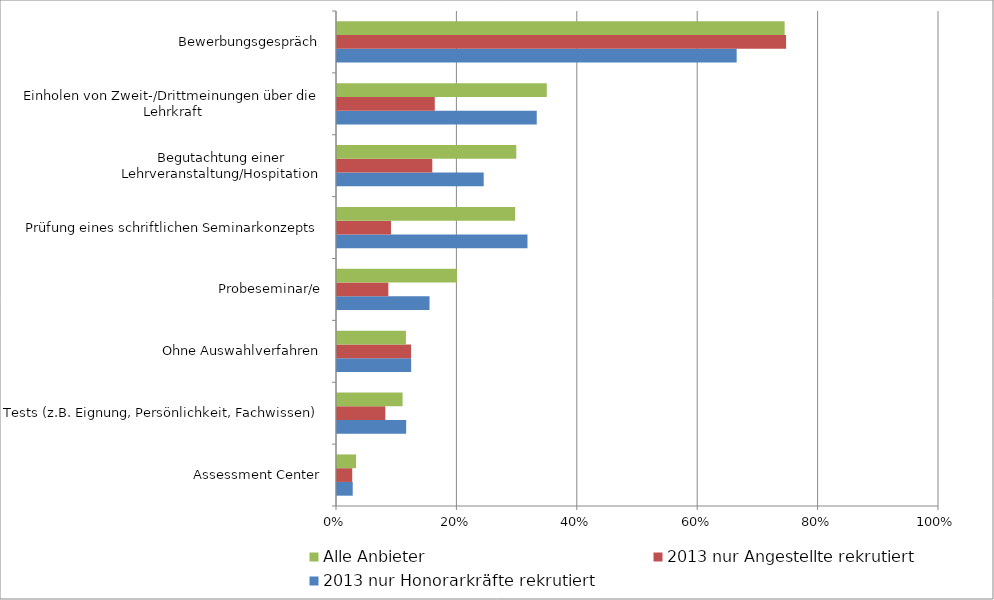
| Category | 2013 nur Honorarkräfte rekrutiert  | 2013 nur Angestellte rekrutiert | Alle Anbieter |
|---|---|---|---|
| Assessment Center | 0.026 | 0.025 | 0.032 |
| Tests (z.B. Eignung, Persönlichkeit, Fachwissen) | 0.115 | 0.08 | 0.109 |
| Ohne Auswahlverfahren | 0.123 | 0.123 | 0.114 |
| Probeseminar/e | 0.154 | 0.085 | 0.199 |
| Prüfung eines schriftlichen Seminarkonzepts | 0.316 | 0.09 | 0.296 |
| Begutachtung einer Lehrveranstaltung/Hospitation | 0.244 | 0.158 | 0.298 |
| Einholen von Zweit-/Drittmeinungen über die Lehrkraft | 0.332 | 0.162 | 0.348 |
| Bewerbungsgespräch | 0.664 | 0.746 | 0.744 |